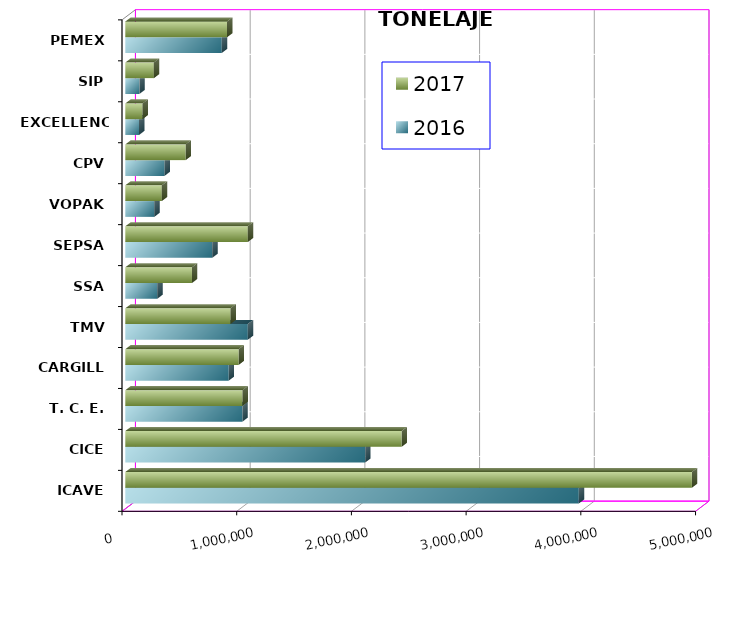
| Category | 2016 | 2017 |
|---|---|---|
| ICAVE | 3953348.39 | 4939587.54 |
| CICE | 2091015.093 | 2409054.305 |
| T. C. E. | 1021442.65 | 1021982.551 |
| CARGILL | 901402.651 | 988389.752 |
| TMV | 1067978.005 | 917471.824 |
| SSA | 279003.101 | 581220.745 |
| SEPSA | 758187.774 | 1067980.05 |
| VOPAK | 253149.884 | 318376.461 |
| CPV | 342004.746 | 526429.2 |
| EXCELLENCE | 119979.387 | 150484.517 |
| SIP | 122663.58 | 248700.4 |
| PEMEX | 840795.799 | 887127.748 |